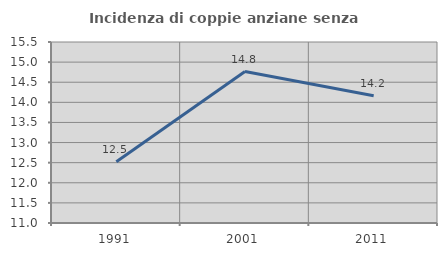
| Category | Incidenza di coppie anziane senza figli  |
|---|---|
| 1991.0 | 12.524 |
| 2001.0 | 14.766 |
| 2011.0 | 14.165 |